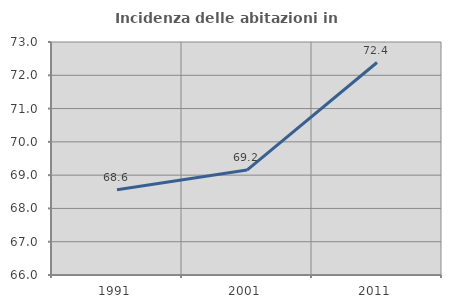
| Category | Incidenza delle abitazioni in proprietà  |
|---|---|
| 1991.0 | 68.558 |
| 2001.0 | 69.152 |
| 2011.0 | 72.383 |